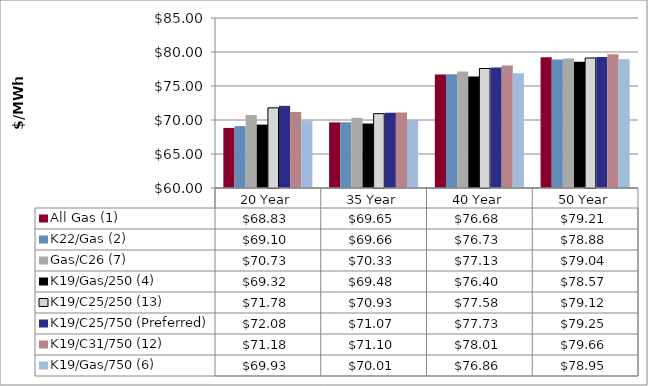
| Category | All Gas (1) | K22/Gas (2) | Gas/C26 (7) | K19/Gas/250 (4) | K19/C25/250 (13) | K19/C25/750 (Preferred) | K19/C31/750 (12) | K19/Gas/750 (6) |
|---|---|---|---|---|---|---|---|---|
| 20 Year | 68.833 | 69.102 | 70.728 | 69.321 | 71.785 | 72.08 | 71.179 | 69.931 |
| 35 Year | 69.647 | 69.658 | 70.327 | 69.482 | 70.932 | 71.07 | 71.097 | 70.01 |
| 40 Year | 76.68 | 76.734 | 77.128 | 76.404 | 77.579 | 77.729 | 78.012 | 76.862 |
| 50 Year | 79.211 | 78.879 | 79.037 | 78.573 | 79.12 | 79.255 | 79.662 | 78.952 |